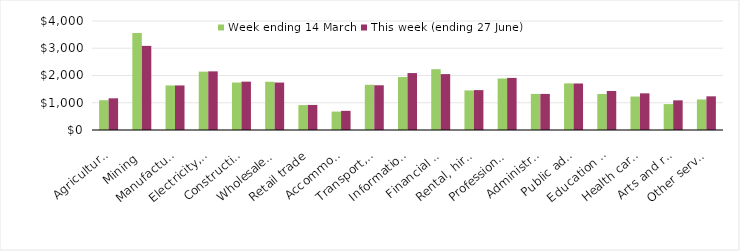
| Category | Week ending 14 March | This week (ending 27 June) |
|---|---|---|
| Agriculture, forestry and fishing | 1093.17 | 1163.07 |
| Mining | 3555.59 | 3087.07 |
| Manufacturing | 1635.09 | 1634.84 |
| Electricity, gas, water and waste services | 2141.71 | 2152.3 |
| Construction | 1742.45 | 1774.23 |
| Wholesale trade | 1770.8 | 1740.5 |
| Retail trade | 913.66 | 919.82 |
| Accommodation and food services | 675.17 | 703.56 |
| Transport, postal and warehousing | 1659.52 | 1641.19 |
| Information media and telecommunications | 1942.77 | 2089.07 |
| Financial and insurance services | 2230.88 | 2050.88 |
| Rental, hiring and real estate services | 1452.48 | 1464.8 |
| Professional, scientific and technical services | 1888.54 | 1911.51 |
| Administrative and support services | 1324.09 | 1324.15 |
| Public administration and safety | 1710.27 | 1706.83 |
| Education and training | 1320.23 | 1433.04 |
| Health care and social assistance | 1227.97 | 1345.14 |
| Arts and recreation services | 950.76 | 1088.93 |
| Other services | 1120.64 | 1235.74 |